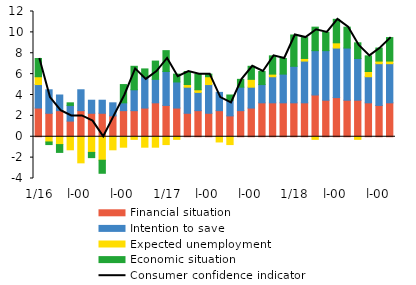
| Category | Financial situation | Intention to save | Expected unemployment | Economic situation |
|---|---|---|---|---|
| 0 | 2.75 | 2.25 | 0.75 | 1.75 |
| 1900-01-01 | 2.25 | 2.25 | -0.5 | -0.25 |
| 1900-01-02 | 2.5 | 1.5 | -0.75 | -0.75 |
| 1900-01-03 | 1.5 | 1.5 | -1.25 | 0.25 |
| 1900-01-04 | 2.5 | 2 | -2.5 | 0 |
| 1900-01-05 | 2.25 | 1.25 | -1.5 | -0.5 |
| 1900-01-06 | 2.25 | 1.25 | -2.25 | -1.25 |
| 1900-01-07 | 2 | 1.25 | -1.25 | 0 |
| 1900-01-08 | 2.5 | 0.75 | -1 | 1.75 |
| 1900-01-09 | 2.5 | 2 | -0.25 | 2.25 |
| 1900-01-10 | 2.75 | 3 | -1 | 0.75 |
| 1900-01-11 | 3.25 | 2.25 | -1 | 1.75 |
| 1900-01-12 | 3 | 3.25 | -0.75 | 2 |
| 1900-01-13 | 2.75 | 2.5 | -0.25 | 0.75 |
| 1900-01-14 | 2.25 | 2.5 | 0.25 | 1.25 |
| 1900-01-15 | 2.5 | 1.75 | 0.25 | 1.5 |
| 1900-01-16 | 2.25 | 2.75 | 0.75 | 0.25 |
| 1900-01-17 | 2.5 | 1.75 | -0.5 | 0 |
| 1900-01-18 | 2 | 1.5 | -0.75 | 0.5 |
| 1900-01-19 | 2.5 | 2.25 | 0 | 0.75 |
| 1900-01-20 | 2.75 | 2 | 0.75 | 1.25 |
| 1900-01-21 | 3.25 | 1.75 | 0 | 1.25 |
| 1900-01-22 | 3.25 | 2.5 | 0.25 | 1.75 |
| 1900-01-23 | 3.25 | 2.75 | 0 | 1.5 |
| 1900-01-24 | 3.25 | 3.5 | 0 | 3 |
| 1900-01-25 | 3.25 | 4 | 0.25 | 2 |
| 1900-01-26 | 4 | 4.25 | -0.25 | 2.25 |
| 1900-01-27 | 3.5 | 4.75 | 0 | 1.75 |
| 1900-01-28 | 3.75 | 4.75 | 0.5 | 2.25 |
| 1900-01-29 | 3.5 | 5 | 0 | 2 |
| 1900-01-30 | 3.5 | 4 | -0.25 | 1.5 |
| 1900-01-31 | 3.25 | 2.5 | 0.5 | 1.5 |
| 1900-02-01 | 3 | 4 | 0.25 | 1.25 |
| 1900-02-02 | 3.25 | 3.75 | 0.25 | 2.25 |